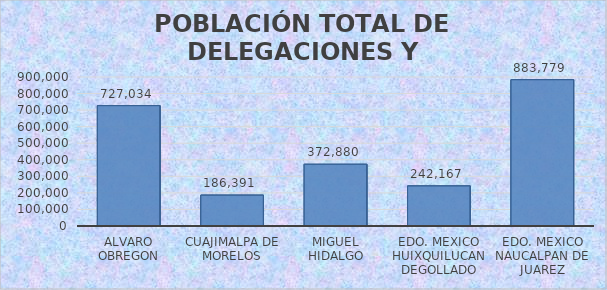
| Category | POBLACIÓN TOTAL |
|---|---|
| ALVARO OBREGON | 727034 |
| CUAJIMALPA DE MORELOS | 186391 |
| MIGUEL HIDALGO | 372880 |
| EDO. MEXICO HUIXQUILUCAN DEGOLLADO | 242167 |
| EDO. MEXICO NAUCALPAN DE JUAREZ | 883779 |